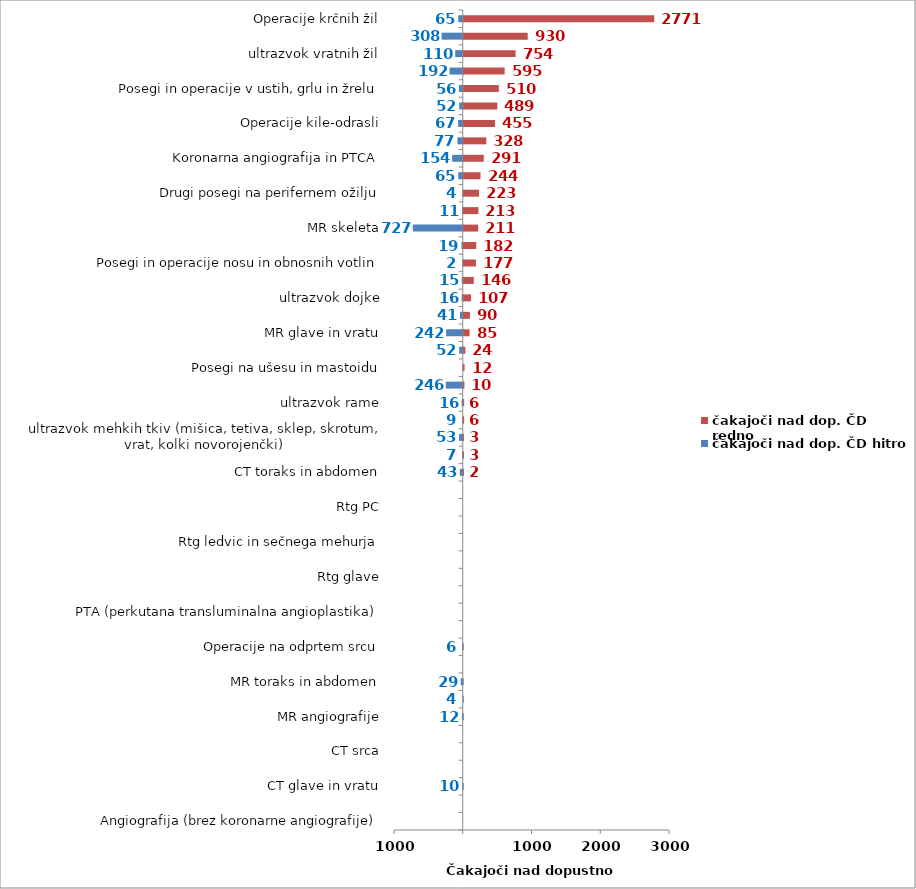
| Category | čakajoči nad dop. ČD hitro | čakajoči nad dop. ČD redno |
|---|---|---|
| Angiografija (brez koronarne angiografije) | 0 | 0 |
| Artroplastika gležnja | 0 | 0 |
| CT glave in vratu | -10 | 0 |
| CT skeleta | 0 | 0 |
| CT srca | 0 | 0 |
| Elektroencefalografija (EEG) | 0 | 0 |
| MR angiografije | -12 | 0 |
| MR srca | -4 | 0 |
| MR toraks in abdomen | -29 | 0 |
| Operacije kile-otroci | 0 | 0 |
| Operacije na odprtem srcu | -6 | 0 |
| Posegi na arterijah (brez PTA) | 0 | 0 |
| PTA (perkutana transluminalna angioplastika) | 0 | 0 |
| Rtg abdomna | 0 | 0 |
| Rtg glave | 0 | 0 |
| Rtg hrbtenice | 0 | 0 |
| Rtg ledvic in sečnega mehurja | 0 | 0 |
| Rtg mamografija | 0 | 0 |
| Rtg PC | 0 | 0 |
| Sklerozacija krčnih žil | 0 | 0 |
| CT toraks in abdomen | -43 | 2 |
| Operacija ščitnice (tudi obščitnice) | -7 | 3 |
| ultrazvok mehkih tkiv (mišica, tetiva, sklep, skrotum, vrat, kolki novorojenčki) | -53 | 3 |
| Rtg skletela | -9 | 6 |
| ultrazvok rame | -16 | 6 |
| Operacija karpalnega kanala | -246 | 10 |
| Posegi na ušesu in mastoidu | 0 | 12 |
| CT angiografije | -52 | 24 |
| MR glave in vratu | -242 | 85 |
| Terapevtske artroskopije (kolenske križne vezi, kolena) | -41 | 90 |
| ultrazvok dojke | -16 | 107 |
| Ortopedska operacija rame (samo terapevstki posegi na rami) | -15 | 146 |
| Posegi in operacije nosu in obnosnih votlin | -2 | 177 |
| Operacije žolčnih kamnov | -19 | 182 |
| MR skeleta | -727 | 211 |
| Operacija sive mrene (katarakta) | -11 | 213 |
| Drugi posegi na perifernem ožilju | -4 | 223 |
| Posegi in operacije hrbtenice | -65 | 244 |
| Koronarna angiografija in PTCA | -154 | 291 |
| Artroplastika kolka (protetika, endoproteza) | -77 | 328 |
| Operacije kile-odrasli | -67 | 455 |
| Artroplastika kolena | -52 | 489 |
| Posegi in operacije v ustih, grlu in žrelu | -56 | 510 |
| Elektromiografija (EMG) | -192 | 595 |
| ultrazvok vratnih žil | -110 | 754 |
| ultrazvok srca | -308 | 930 |
| Operacije krčnih žil | -65 | 2771 |